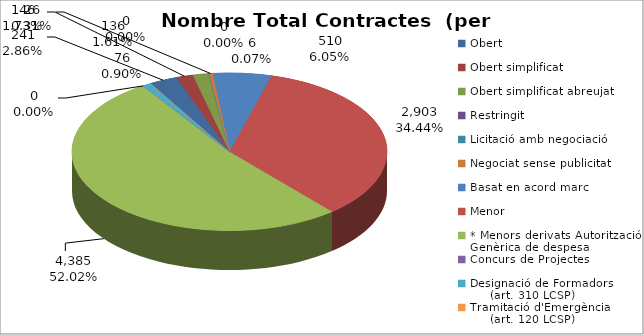
| Category | Nombre Total Contractes |
|---|---|
| Obert | 241 |
| Obert simplificat | 146 |
| Obert simplificat abreujat | 136 |
| Restringit | 6 |
| Licitació amb negociació | 0 |
| Negociat sense publicitat | 26 |
| Basat en acord marc | 510 |
| Menor | 2903 |
| * Menors derivats Autorització Genèrica de despesa | 4385 |
| Concurs de Projectes | 0 |
| Designació de Formadors
     (art. 310 LCSP) | 76 |
| Tramitació d'Emergència
     (art. 120 LCSP) | 0 |